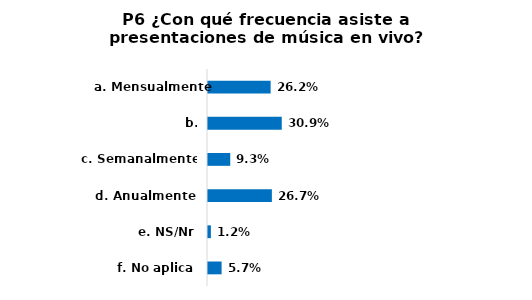
| Category | Series 0 |
|---|---|
| a. Mensualmente | 0.262 |
| b. Trimestralmente | 0.309 |
| c. Semanalmente | 0.093 |
| d. Anualmente | 0.267 |
| e. NS/Nr | 0.012 |
| f. No aplica | 0.057 |